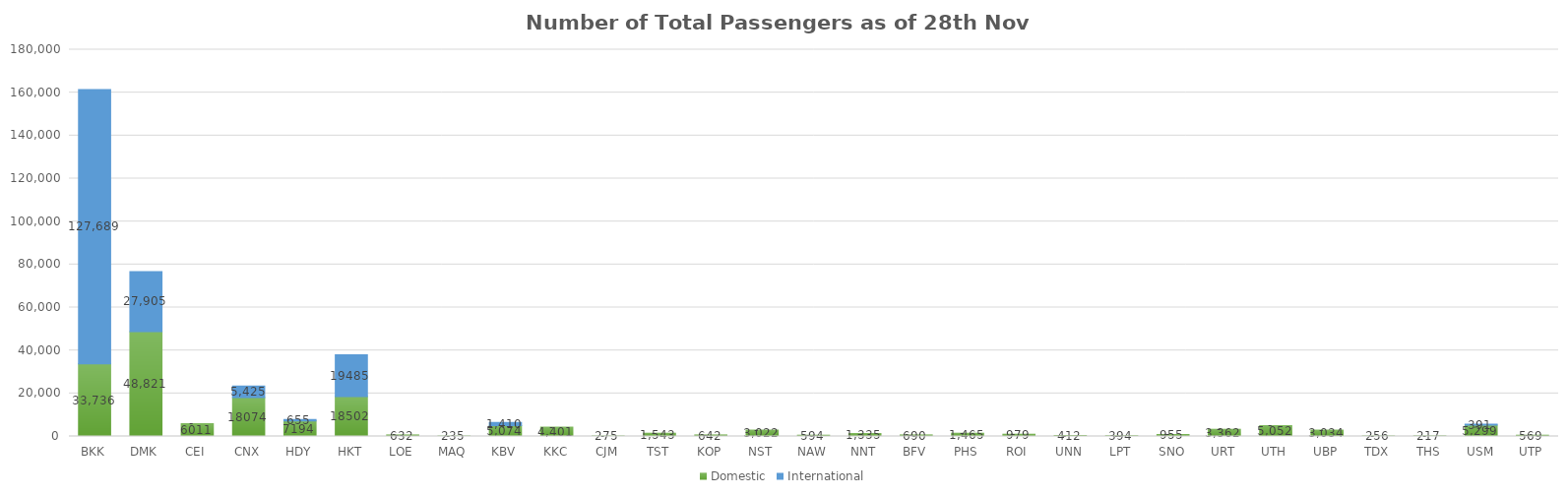
| Category | Domestic | International |
|---|---|---|
| BKK | 33736 | 127689 |
| DMK | 48821 | 27905 |
| CEI | 6011 | 0 |
| CNX | 18074 | 5425 |
| HDY | 7194 | 655 |
| HKT | 18502 | 19485 |
| LOE | 632 | 0 |
| MAQ | 235 | 0 |
| KBV | 5074 | 1410 |
| KKC | 4401 | 0 |
| CJM | 275 | 0 |
| TST | 1543 | 0 |
| KOP | 642 | 0 |
| NST | 3022 | 0 |
| NAW | 594 | 0 |
| NNT | 1335 | 0 |
| BFV | 690 | 0 |
| PHS | 1465 | 0 |
| ROI | 979 | 0 |
| UNN | 412 | 0 |
| LPT | 394 | 0 |
| SNO | 955 | 0 |
| URT | 3362 | 0 |
| UTH | 5052 | 0 |
| UBP | 3034 | 0 |
| TDX | 256 | 0 |
| THS | 217 | 0 |
| USM | 5299 | 391 |
| UTP | 569 | 0 |